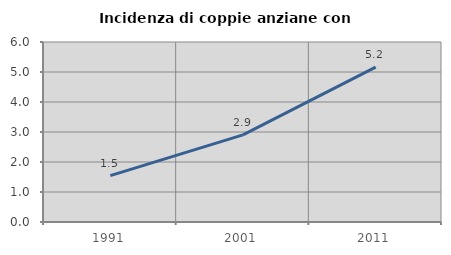
| Category | Incidenza di coppie anziane con figli |
|---|---|
| 1991.0 | 1.548 |
| 2001.0 | 2.903 |
| 2011.0 | 5.161 |